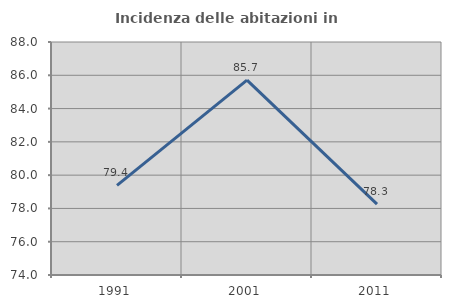
| Category | Incidenza delle abitazioni in proprietà  |
|---|---|
| 1991.0 | 79.389 |
| 2001.0 | 85.714 |
| 2011.0 | 78.261 |